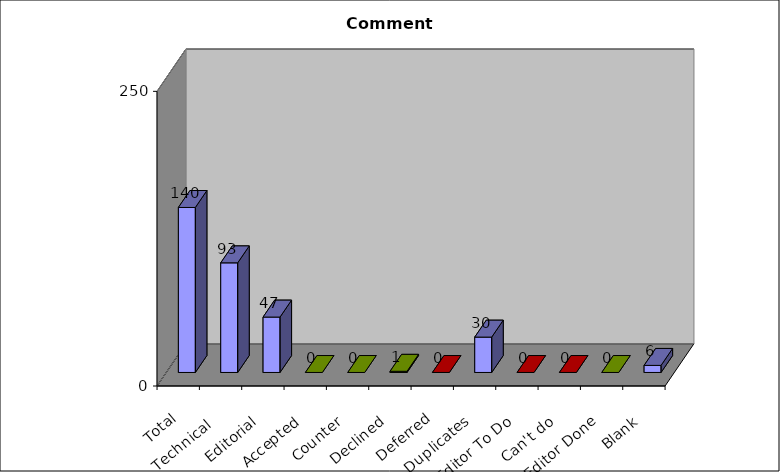
| Category | Series 0 |
|---|---|
| Total | 140 |
| Technical  | 93 |
| Editorial | 47 |
| Accepted | 0 |
| Counter | 0 |
| Declined | 1 |
| Deferred | 0 |
| Duplicates | 30 |
| Editor To Do | 0 |
| Can't do | 0 |
| Editor Done | 0 |
| Blank | 6 |